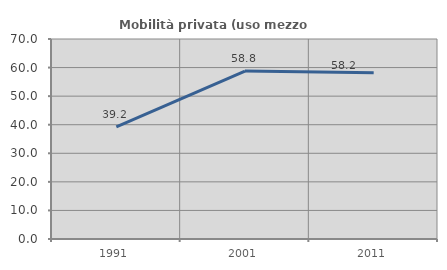
| Category | Mobilità privata (uso mezzo privato) |
|---|---|
| 1991.0 | 39.216 |
| 2001.0 | 58.774 |
| 2011.0 | 58.216 |